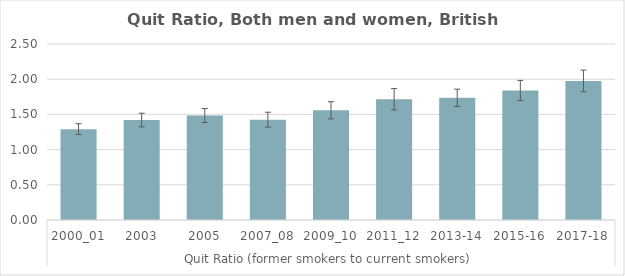
| Category | Series 0 |
|---|---|
| 0 | 1.291 |
| 1 | 1.42 |
| 2 | 1.484 |
| 3 | 1.425 |
| 4 | 1.558 |
| 5 | 1.716 |
| 6 | 1.735 |
| 7 | 1.84 |
| 8 | 1.976 |